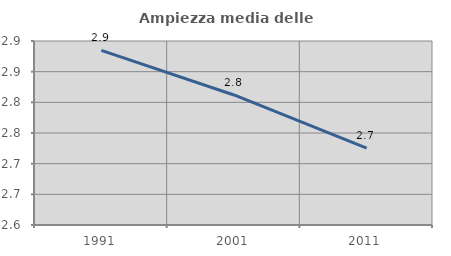
| Category | Ampiezza media delle famiglie |
|---|---|
| 1991.0 | 2.885 |
| 2001.0 | 2.812 |
| 2011.0 | 2.725 |